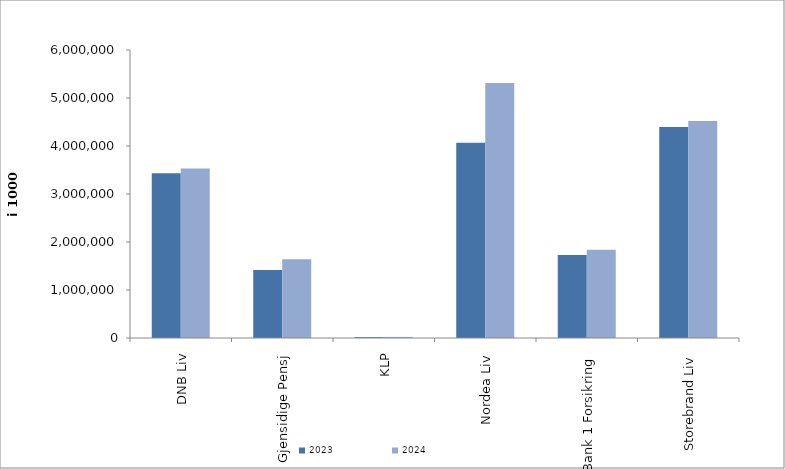
| Category | 2023 | 2024 |
|---|---|---|
| DNB Liv | 3430435.716 | 3528916.993 |
| Gjensidige Pensj | 1416253 | 1641372 |
| KLP | 18550.222 | 22688.987 |
| Nordea Liv | 4065856.854 | 5311313.368 |
| SpareBank 1 Forsikring | 1726963.186 | 1839822.981 |
| Storebrand Liv | 4395415.706 | 4520753.174 |